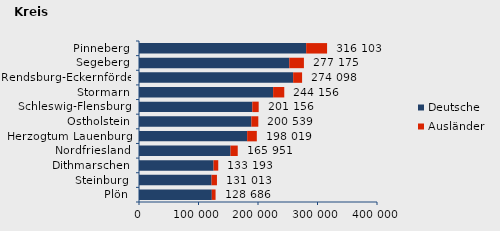
| Category | Deutsche | Ausländer | Series 2 |
|---|---|---|---|
| Plön | 122384 | 6302 | 128686 |
| Steinburg | 121935 | 9078 | 131013 |
| Dithmarschen | 125257 | 7936 | 133193 |
| Nordfriesland | 153827 | 12124 | 165951 |
| Herzogtum Lauenburg | 181752 | 16267 | 198019 |
| Ostholstein | 188849 | 11690 | 200539 |
| Schleswig-Flensburg | 190441 | 10715 | 201156 |
| Stormarn | 225410 | 18746 | 244156 |
| Rendsburg-Eckernförde | 259065 | 15033 | 274098 |
| Segeberg | 252561 | 24614 | 277175 |
| Pinneberg | 280944 | 35159 | 316103 |